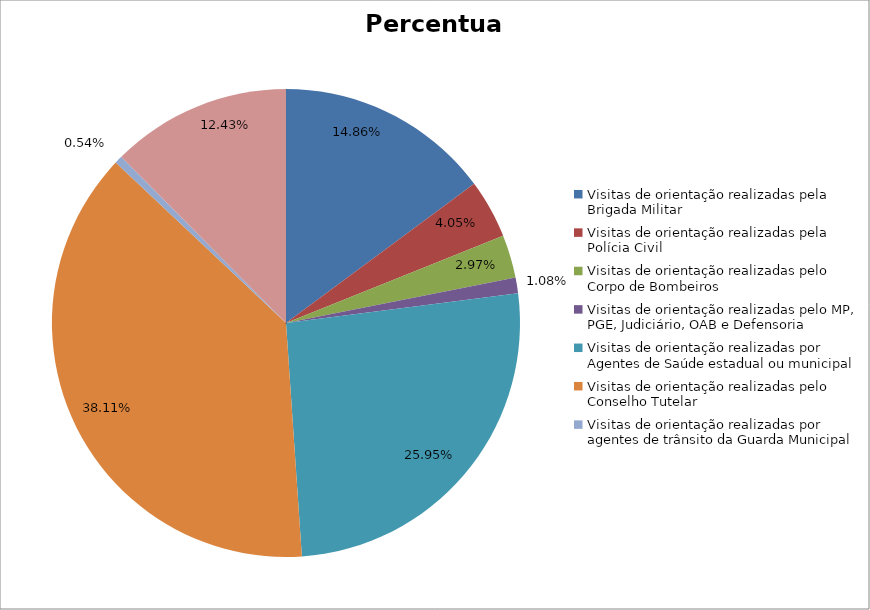
| Category | Percentual |
|---|---|
| Visitas de orientação realizadas pela Brigada Militar | 0.149 |
| Visitas de orientação realizadas pela Polícia Civil | 0.041 |
| Visitas de orientação realizadas pelo Corpo de Bombeiros | 0.03 |
| Visitas de orientação realizadas pelo MP, PGE, Judiciário, OAB e Defensoria | 0.011 |
| Visitas de orientação realizadas por Agentes de Saúde estadual ou municipal | 0.259 |
| Visitas de orientação realizadas pelo Conselho Tutelar | 0.381 |
| Visitas de orientação realizadas por agentes de trânsito da Guarda Municipal | 0.005 |
| Visitas de orientação realizadas por ONGs, entidades privadas, CRAS e CREAS | 0.124 |